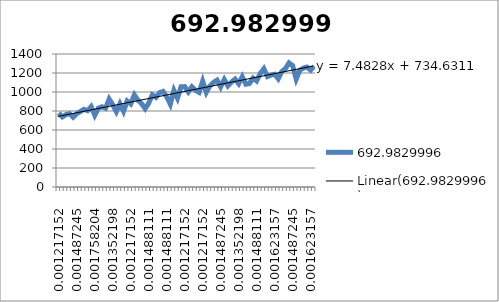
| Category | 692.9829996 |
|---|---|
| 0.00121715162281113 | 778.936 |
| 0.00148811069673709 | 737.891 |
| 0.00148811069673709 | 762.512 |
| 0.00135219831780302 | 771.688 |
| 0.0013530640017452 | 734.71 |
| 0.00148724501279471 | 772.174 |
| 0.00148811069673709 | 794.514 |
| 0.00148811069673709 | 817.803 |
| 0.00148811069673709 | 803.533 |
| 0.00162315739172897 | 845.934 |
| 0.00175820408672066 | 755.702 |
| 0.00148811069673709 | 829.839 |
| 0.00135219831780302 | 844.539 |
| 0.00148811069673709 | 829.518 |
| 0.00162315739172878 | 925.775 |
| 0.00135219831780302 | 865.414 |
| 0.00121801730675332 | 792.704 |
| 0.00148811069673709 | 876.753 |
| 0.00135219831780302 | 797.406 |
| 0.00148811069673709 | 905.198 |
| 0.00121715162281113 | 874.787 |
| 0.00148811069673709 | 969.461 |
| 0.00121715162281094 | 913.802 |
| 0.00135219831780302 | 877.991 |
| 0.0013530640017452 | 824.816 |
| 0.00148811069673709 | 883.602 |
| 0.00162315739172897 | 970.425 |
| 0.00135219831780302 | 942.905 |
| 0.00162315739172878 | 992.797 |
| 0.00148811069673709 | 1006.118 |
| 0.00148811069673709 | 948.978 |
| 0.00162315739172897 | 871.848 |
| 0.00135219831780283 | 1016.869 |
| 0.00162315739172897 | 934.771 |
| 0.0013530640017452 | 1055.885 |
| 0.00121715162281113 | 1056.637 |
| 0.00135219831780302 | 1001.26 |
| 0.0013530640017452 | 1055.791 |
| 0.00148811069673709 | 1017.653 |
| 0.00162315739172878 | 996.002 |
| 0.00121715162281113 | 1114.443 |
| 0.00148811069673709 | 995.641 |
| 0.00162315739172897 | 1063.619 |
| 0.00162315739172897 | 1100.573 |
| 0.00162315739172878 | 1125.359 |
| 0.0014872450127949 | 1053.667 |
| 0.0013530640017452 | 1131.204 |
| 0.00148811069673709 | 1064.739 |
| 0.00135219831780283 | 1104.335 |
| 0.00135306400174539 | 1135.554 |
| 0.00135219831780283 | 1086.759 |
| 0.0013530640017452 | 1160.488 |
| 0.00121715162281113 | 1081.955 |
| 0.00148811069673709 | 1089.666 |
| 0.00135219831780302 | 1146.031 |
| 0.00148811069673709 | 1116.434 |
| 0.00148811069673709 | 1195.155 |
| 0.00148724501279471 | 1245.203 |
| 0.0013530640017452 | 1162.259 |
| 0.00148811069673709 | 1178.401 |
| 0.00162315739172897 | 1186.856 |
| 0.00162315739172878 | 1138.923 |
| 0.00162315739172897 | 1215.935 |
| 0.00135219831780302 | 1246.003 |
| 0.0013530640017452 | 1306.418 |
| 0.00148724501279471 | 1278.044 |
| 0.00135306400174539 | 1135.624 |
| 0.00162315739172878 | 1228.92 |
| 0.00135219831780302 | 1252.357 |
| 0.00121801730675332 | 1262.395 |
| 0.00162315739172897 | 1230.44 |
| 0.00121715162281113 | 1269.942 |